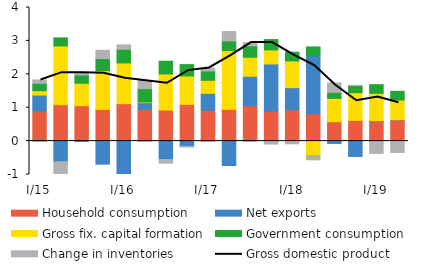
| Category | Household consumption | Net exports | Gross fix. capital formation | Government consumption | Change in inventories |
|---|---|---|---|---|---|
| I/15 | 0.91 | 0.47 | 0.13 | 0.22 | 0.1 |
| II | 1.09 | -0.62 | 1.76 | 0.24 | -0.42 |
| III | 1.06 | -0.01 | 0.67 | 0.25 | 0.08 |
| IV | 0.95 | -0.69 | 1.16 | 0.36 | 0.25 |
| I/16 | 1.12 | -1 | 1.22 | 0.41 | 0.13 |
| II | 0.95 | 0.2 | 0.02 | 0.4 | 0.24 |
| III | 0.93 | -0.55 | 1.08 | 0.38 | -0.11 |
| IV | 1.1 | -0.16 | 0.85 | 0.34 | -0.02 |
| I/17 | 0.92 | 0.51 | 0.39 | 0.28 | 0.09 |
| II | 0.95 | -0.73 | 1.76 | 0.29 | 0.28 |
| III | 1.06 | 0.88 | 0.57 | 0.34 | 0.1 |
| IV | 0.9 | 1.41 | 0.42 | 0.31 | -0.09 |
| I/18 | 0.94 | 0.66 | 0.8 | 0.26 | -0.08 |
| II | 0.82 | 1.74 | -0.43 | 0.26 | -0.13 |
| III | 0.58 | -0.07 | 0.7 | 0.18 | 0.28 |
| IV | 0.62 | -0.46 | 0.83 | 0.21 | 0.01 |
| I/19 | 0.59 | 0.02 | 0.82 | 0.26 | -0.37 |
| II | 0.63 | 0.01 | 0.59 | 0.26 | -0.34 |